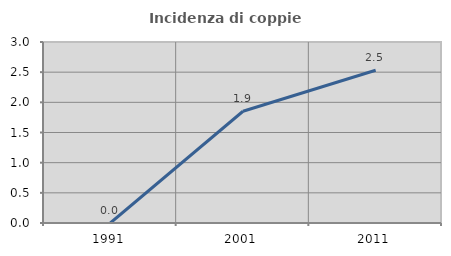
| Category | Incidenza di coppie miste |
|---|---|
| 1991.0 | 0 |
| 2001.0 | 1.852 |
| 2011.0 | 2.532 |